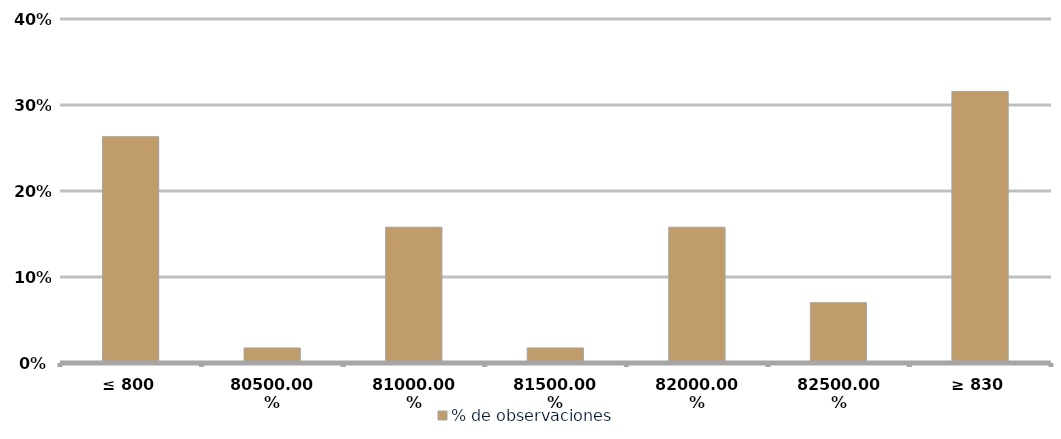
| Category | % de observaciones  |
|---|---|
| ≤ 800 | 0.263 |
| 805 | 0.018 |
| 810 | 0.158 |
| 815 | 0.018 |
| 820 | 0.158 |
| 825 | 0.07 |
| ≥ 830 | 0.316 |